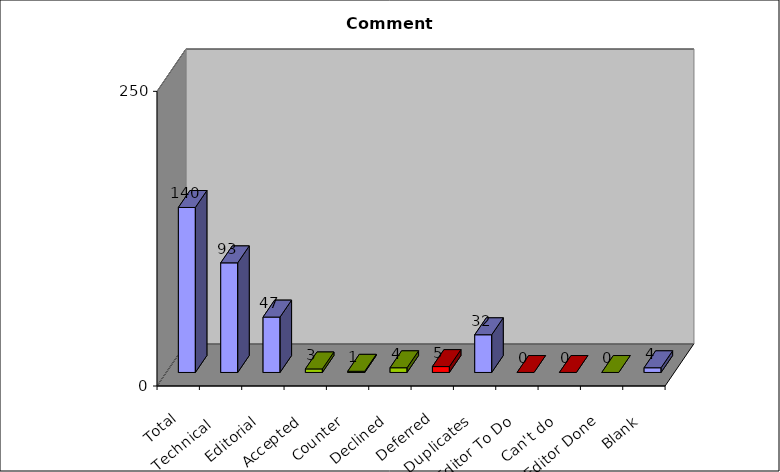
| Category | Series 0 |
|---|---|
| Total | 140 |
| Technical  | 93 |
| Editorial | 47 |
| Accepted | 3 |
| Counter | 1 |
| Declined | 4 |
| Deferred | 5 |
| Duplicates | 32 |
| Editor To Do | 0 |
| Can't do | 0 |
| Editor Done | 0 |
| Blank | 4 |